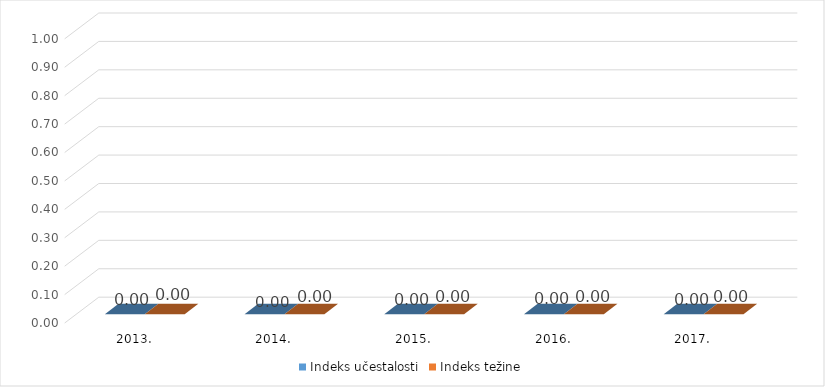
| Category | Indeks učestalosti | Indeks težine |
|---|---|---|
| 2013. | 0 | 0 |
| 2014. | 0 | 0 |
| 2015. | 0 | 0 |
| 2016. | 0 | 0 |
| 2017. | 0 | 0 |